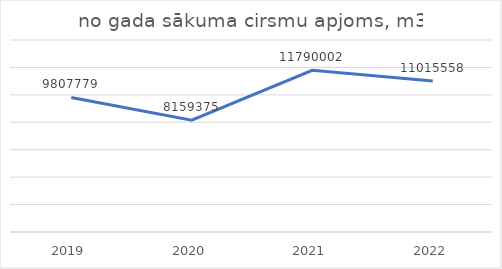
| Category | no gada sākuma cirsmu apjoms, m3 |
|---|---|
| 2019.0 | 9807779 |
| 2020.0 | 8159375 |
| 2021.0 | 11790002 |
| 2022.0 | 11015558 |